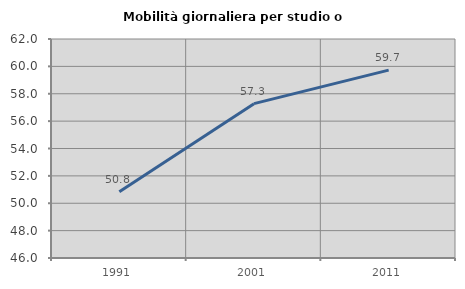
| Category | Mobilità giornaliera per studio o lavoro |
|---|---|
| 1991.0 | 50.843 |
| 2001.0 | 57.276 |
| 2011.0 | 59.727 |